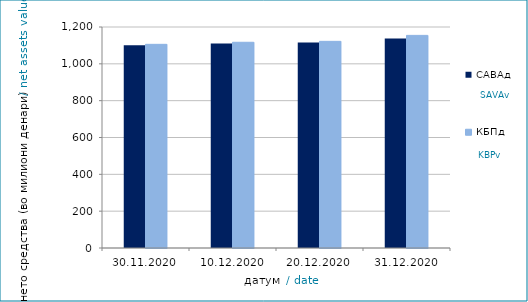
| Category | САВАд | КБПд |
|---|---|---|
| 2020-11-30 | 1100.874 | 1105.89 |
| 2020-12-10 | 1109.74 | 1117.074 |
| 2020-12-20 | 1116.471 | 1122.075 |
| 2020-12-31 | 1137.613 | 1154.517 |